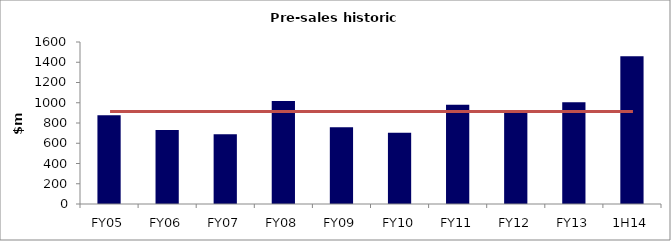
| Category | Series 0 |
|---|---|
| FY05 | 877 |
| FY06 | 730 |
| FY07 | 689 |
| FY08 | 1018 |
| FY09 | 759 |
| FY10 | 704 |
| FY11 | 980.3 |
| FY12 | 907.7 |
| FY13 | 1005.402 |
| 1H14 | 1458.523 |